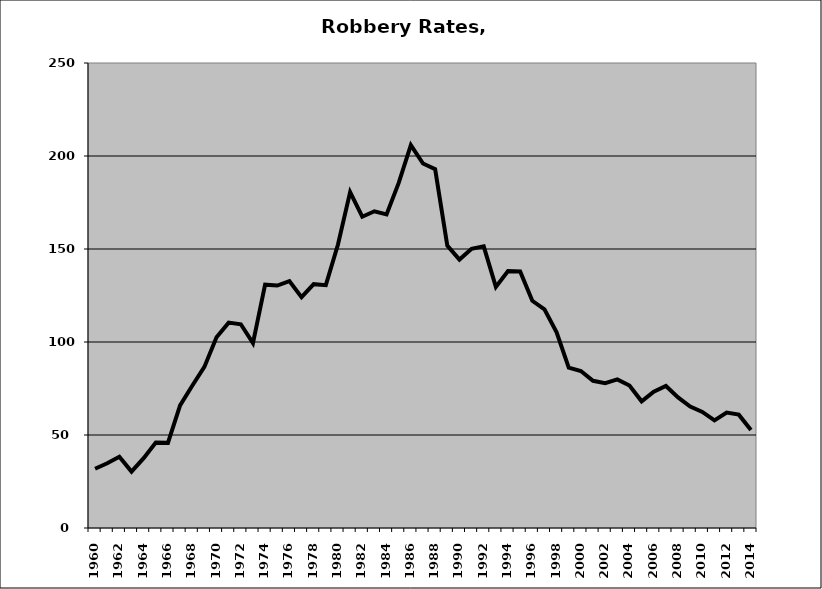
| Category | Robbery |
|---|---|
| 1960.0 | 31.832 |
| 1961.0 | 34.797 |
| 1962.0 | 38.305 |
| 1963.0 | 30.34 |
| 1964.0 | 37.573 |
| 1965.0 | 45.972 |
| 1966.0 | 45.78 |
| 1967.0 | 65.883 |
| 1968.0 | 76.494 |
| 1969.0 | 86.614 |
| 1970.0 | 102.516 |
| 1971.0 | 110.426 |
| 1972.0 | 109.533 |
| 1973.0 | 99.371 |
| 1974.0 | 130.803 |
| 1975.0 | 130.332 |
| 1976.0 | 132.718 |
| 1977.0 | 124.074 |
| 1978.0 | 131.097 |
| 1979.0 | 130.55 |
| 1980.0 | 152.386 |
| 1981.0 | 180.582 |
| 1982.0 | 167.346 |
| 1983.0 | 170.285 |
| 1984.0 | 168.586 |
| 1985.0 | 185.56 |
| 1986.0 | 205.893 |
| 1987.0 | 195.962 |
| 1988.0 | 192.959 |
| 1989.0 | 151.844 |
| 1990.0 | 144.319 |
| 1991.0 | 150.137 |
| 1992.0 | 151.394 |
| 1993.0 | 129.617 |
| 1994.0 | 138.172 |
| 1995.0 | 137.918 |
| 1996.0 | 122.16 |
| 1997.0 | 117.515 |
| 1998.0 | 105.18 |
| 1999.0 | 86.184 |
| 2000.0 | 84.41 |
| 2001.0 | 79.143 |
| 2002.0 | 77.89 |
| 2003.0 | 79.875 |
| 2004.0 | 76.6 |
| 2005.0 | 68.098 |
| 2006.0 | 73.282 |
| 2007.0 | 76.372 |
| 2008.0 | 70.209 |
| 2009.0 | 65.322 |
| 2010.0 | 62.385 |
| 2011.0 | 57.83 |
| 2012.0 | 62.029 |
| 2013.0 | 60.946 |
| 2014.0 | 52.717 |